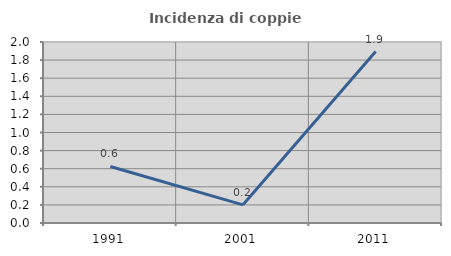
| Category | Incidenza di coppie miste |
|---|---|
| 1991.0 | 0.625 |
| 2001.0 | 0.201 |
| 2011.0 | 1.895 |